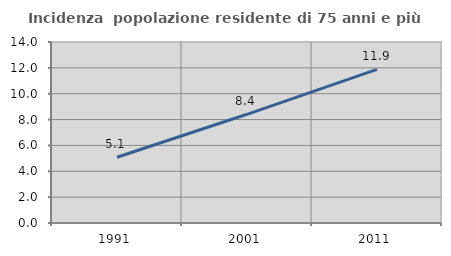
| Category | Incidenza  popolazione residente di 75 anni e più |
|---|---|
| 1991.0 | 5.083 |
| 2001.0 | 8.408 |
| 2011.0 | 11.886 |